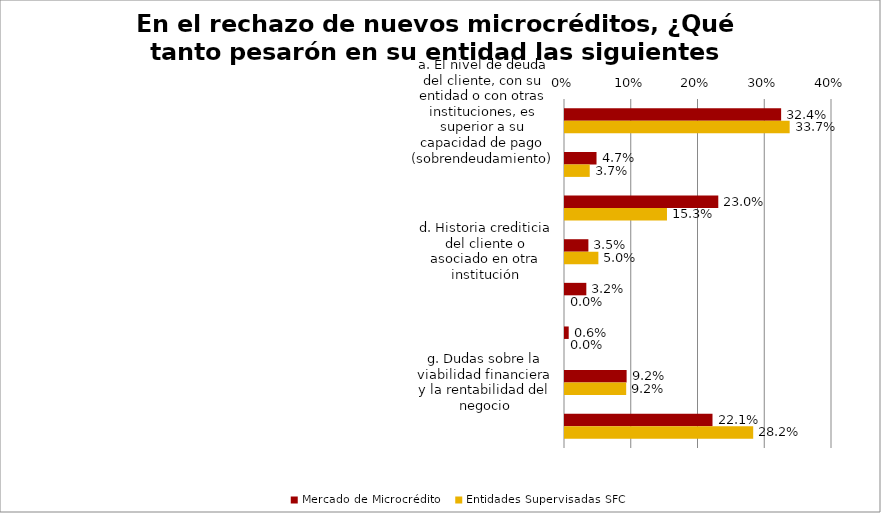
| Category | Mercado de Microcrédito | Entidades Supervisadas SFC |
|---|---|---|
| a. El nivel de deuda del cliente, con su entidad o con otras instituciones, es superior a su capacidad de pago (sobrendeudamiento) | 0.324 | 0.337 |
| b. Crédito con más de tres entidades | 0.047 | 0.037 |
| c. Mala historia crediticia | 0.23 | 0.153 |
| d. Historia crediticia del cliente o asociado en otra institución | 0.035 | 0.05 |
| e. Poco tiempo de creada la microempresa | 0.032 | 0 |
| f. Por sector productivo al cual pertenece el aplicante de crédito o del cual deriva sus principales fuentes de ingreso | 0.006 | 0 |
| g. Dudas sobre la viabilidad financiera y la rentabilidad del negocio | 0.092 | 0.092 |
| h. Capacidad de pago del cliente | 0.221 | 0.282 |